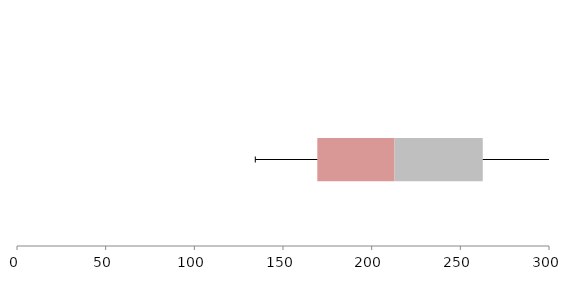
| Category | Series 1 | Series 2 | Series 3 |
|---|---|---|---|
| 0 | 169.358 | 43.498 | 49.798 |